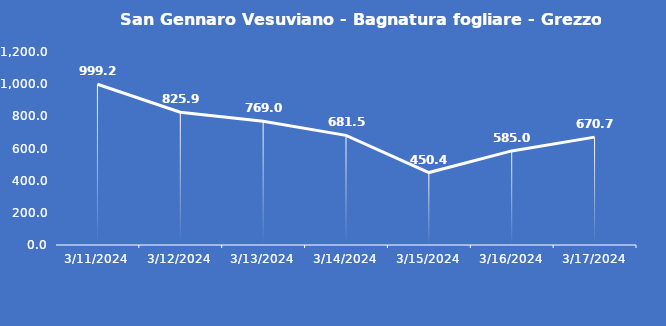
| Category | San Gennaro Vesuviano - Bagnatura fogliare - Grezzo (min) |
|---|---|
| 3/11/24 | 999.2 |
| 3/12/24 | 825.9 |
| 3/13/24 | 769 |
| 3/14/24 | 681.5 |
| 3/15/24 | 450.4 |
| 3/16/24 | 585 |
| 3/17/24 | 670.7 |